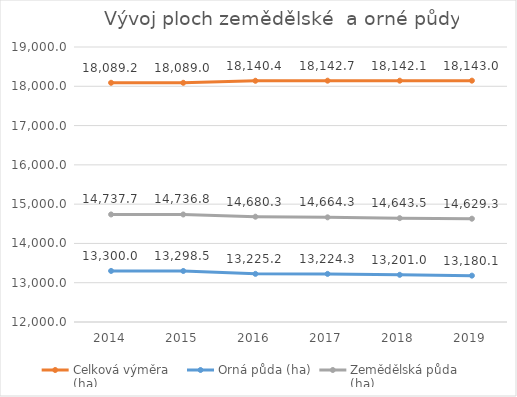
| Category | Celková výměra
(ha) | Orná půda (ha) | Zemědělská půda 
(ha) |
|---|---|---|---|
| 2014.0 | 18089.153 | 13299.988 | 14737.691 |
| 2015.0 | 18088.968 | 13298.49 | 14736.796 |
| 2016.0 | 18140.448 | 13225.181 | 14680.315 |
| 2017.0 | 18142.699 | 13224.288 | 14664.26 |
| 2018.0 | 18142.119 | 13200.968 | 14643.497 |
| 2019.0 | 18143.028 | 13180.089 | 14629.341 |